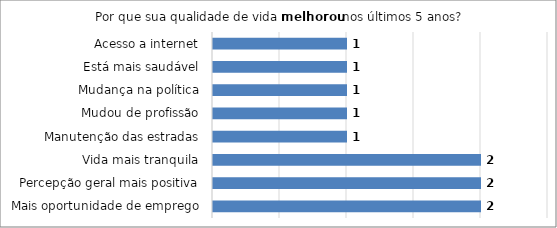
| Category | Series 0 |
|---|---|
| Mais oportunidade de emprego | 2 |
| Percepção geral mais positiva | 2 |
| Vida mais tranquila | 2 |
| Manutenção das estradas | 1 |
| Mudou de profissão | 1 |
| Mudança na política | 1 |
| Está mais saudável | 1 |
| Acesso a internet | 1 |